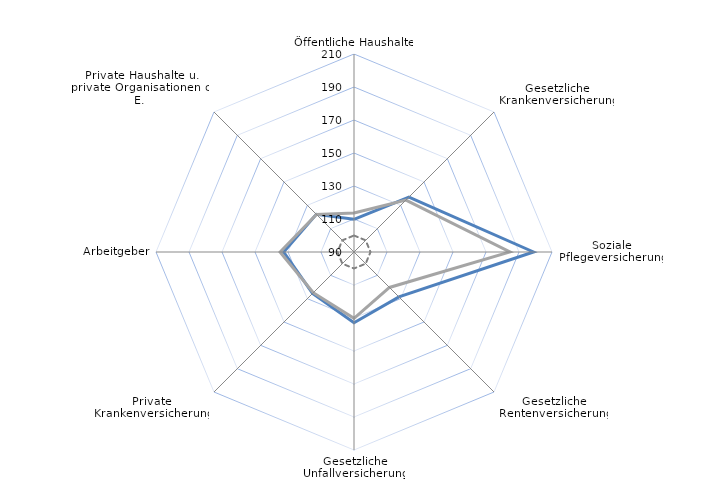
| Category | Baden-Württemberg - Summe von Messzahl | Baden-Württemberg - Summe von Deutschland | Baden-Württemberg - Summe von Ref |
|---|---|---|---|
| Öffentliche Haushalte | 109.8 | 113.6 | 100 |
| Gesetzliche Krankenversicherung | 137.1 | 134.5 | 100 |
| Soziale Pflegeversicherung | 198.8 | 184.5 | 100 |
| Gesetzliche Rentenversicherung | 128.5 | 120.4 | 100 |
| Gesetzliche Unfallversicherung | 132.9 | 130.2 | 100 |
| Private Krankenversicherung | 125.5 | 124.9 | 100 |
| Arbeitgeber | 132.6 | 134.8 | 100 |
| Private Haushalte u. private Organisationen o. E. | 122.3 | 122.2 | 100 |